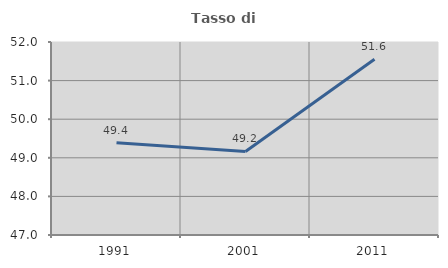
| Category | Tasso di occupazione   |
|---|---|
| 1991.0 | 49.393 |
| 2001.0 | 49.165 |
| 2011.0 | 51.554 |